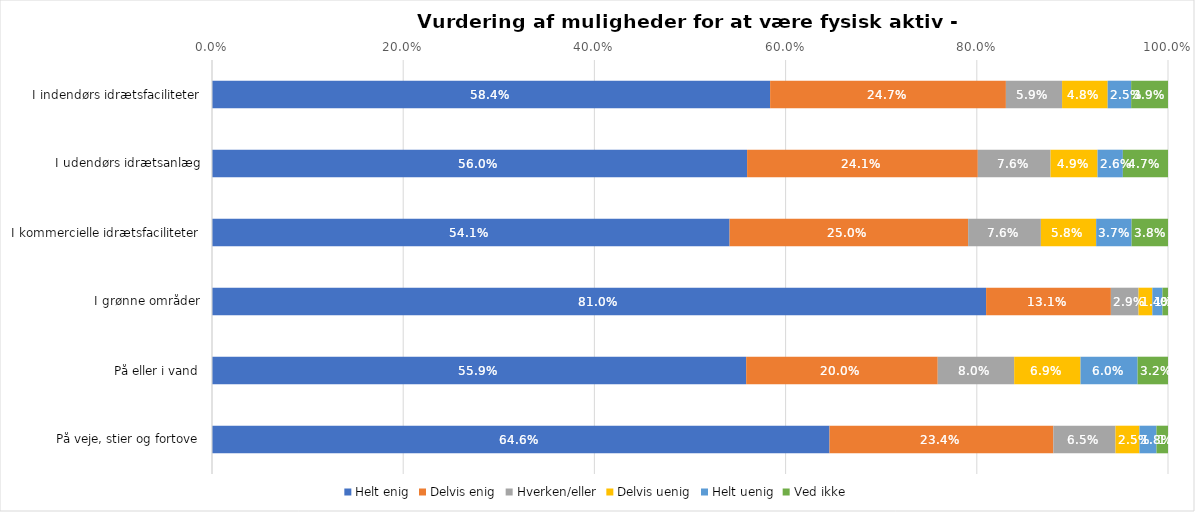
| Category | Helt enig | Delvis enig | Hverken/eller | Delvis uenig | Helt uenig | Ved ikke |
|---|---|---|---|---|---|---|
| I indendørs idrætsfaciliteter | 0.584 | 0.247 | 0.059 | 0.048 | 0.025 | 0.039 |
| I udendørs idrætsanlæg | 0.56 | 0.241 | 0.076 | 0.049 | 0.026 | 0.047 |
| I kommercielle idrætsfaciliteter | 0.541 | 0.25 | 0.076 | 0.058 | 0.037 | 0.038 |
| I grønne områder | 0.81 | 0.131 | 0.029 | 0.014 | 0.011 | 0.006 |
| På eller i vand | 0.559 | 0.2 | 0.08 | 0.069 | 0.06 | 0.032 |
| På veje, stier og fortove | 0.646 | 0.234 | 0.065 | 0.025 | 0.018 | 0.012 |